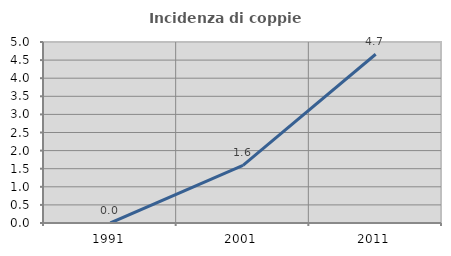
| Category | Incidenza di coppie miste |
|---|---|
| 1991.0 | 0 |
| 2001.0 | 1.593 |
| 2011.0 | 4.661 |